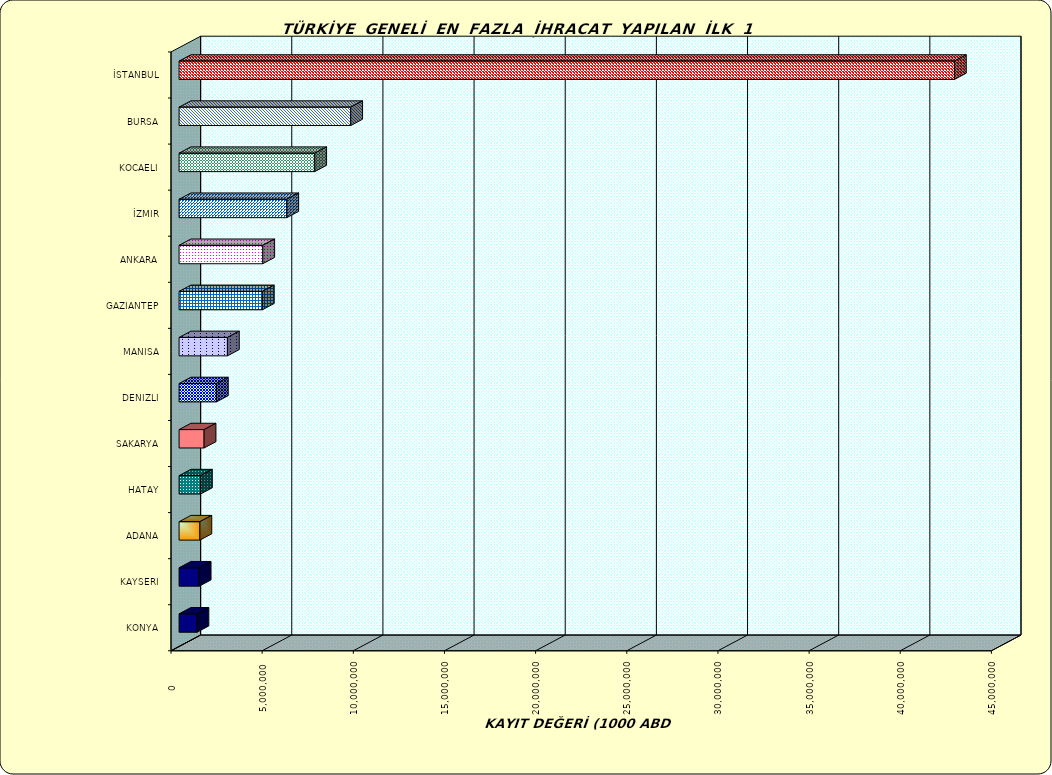
| Category | Series 0 |
|---|---|
| İSTANBUL | 42529647.332 |
| BURSA | 9414869.332 |
| KOCAELI | 7441564.256 |
| İZMIR | 5908001.228 |
| ANKARA | 4590731.739 |
| GAZIANTEP | 4567963.827 |
| MANISA | 2651925.402 |
| DENIZLI | 2045932.82 |
| SAKARYA | 1372852.183 |
| HATAY | 1172476.269 |
| ADANA | 1143152.245 |
| KAYSERI | 1103501.594 |
| KONYA | 981980.236 |